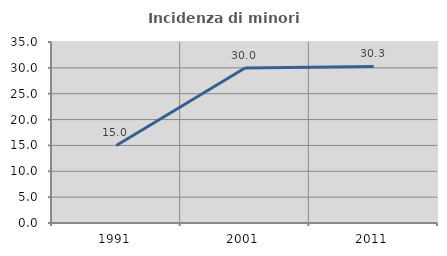
| Category | Incidenza di minori stranieri |
|---|---|
| 1991.0 | 15 |
| 2001.0 | 29.956 |
| 2011.0 | 30.269 |